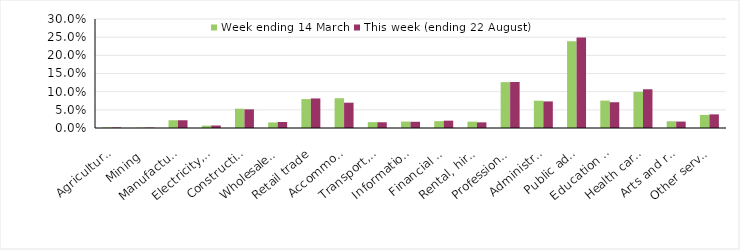
| Category | Week ending 14 March | This week (ending 22 August) |
|---|---|---|
| Agriculture, forestry and fishing | 0.002 | 0.001 |
| Mining | 0.001 | 0.001 |
| Manufacturing | 0.021 | 0.021 |
| Electricity, gas, water and waste services | 0.006 | 0.007 |
| Construction | 0.053 | 0.051 |
| Wholesale trade | 0.015 | 0.017 |
| Retail trade | 0.08 | 0.081 |
| Accommodation and food services | 0.082 | 0.07 |
| Transport, postal and warehousing | 0.016 | 0.016 |
| Information media and telecommunications | 0.018 | 0.017 |
| Financial and insurance services | 0.019 | 0.02 |
| Rental, hiring and real estate services | 0.017 | 0.016 |
| Professional, scientific and technical services | 0.126 | 0.127 |
| Administrative and support services | 0.075 | 0.073 |
| Public administration and safety | 0.239 | 0.249 |
| Education and training | 0.075 | 0.071 |
| Health care and social assistance | 0.1 | 0.107 |
| Arts and recreation services | 0.019 | 0.018 |
| Other services | 0.036 | 0.037 |